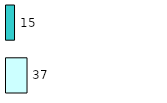
| Category | Series 0 | Series 1 |
|---|---|---|
| 0 | 37 | 15 |